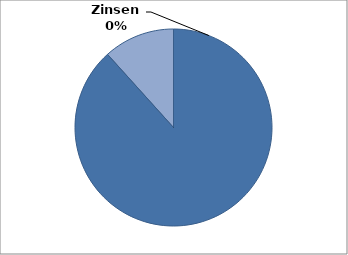
| Category | Series 0 |
|---|---|
| 0 | 10000 |
| 1 | 1322.74 |